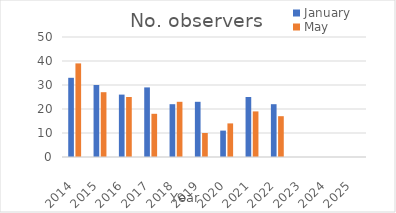
| Category | January | May |
|---|---|---|
| 2014.0 | 33 | 39 |
| 2015.0 | 30 | 27 |
| 2016.0 | 26 | 25 |
| 2017.0 | 29 | 18 |
| 2018.0 | 22 | 23 |
| 2019.0 | 23 | 10 |
| 2020.0 | 11 | 14 |
| 2021.0 | 25 | 19 |
| 2022.0 | 22 | 17 |
| 2023.0 | 0 | 0 |
| 2024.0 | 0 | 0 |
| 2025.0 | 0 | 0 |